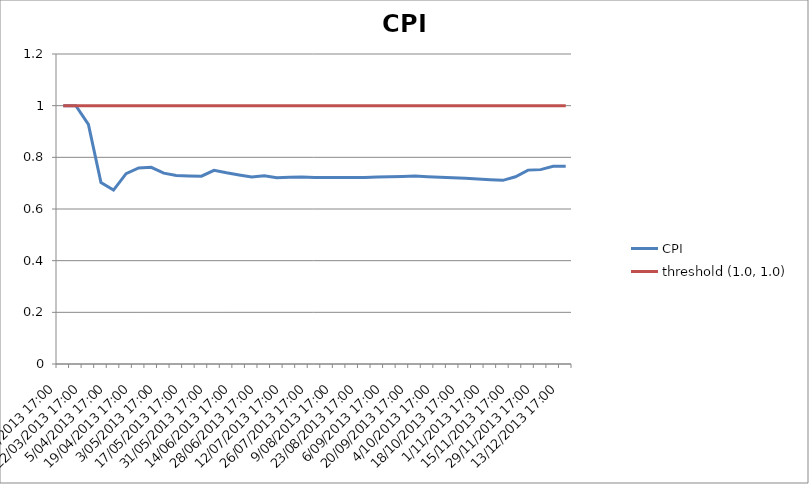
| Category | CPI | threshold (1.0, 1.0) |
|---|---|---|
| 8/03/2013 17:00 | 1 | 1 |
| 15/03/2013 17:00 | 1 | 1 |
| 22/03/2013 17:00 | 0.928 | 1 |
| 29/03/2013 17:00 | 0.702 | 1 |
| 5/04/2013 17:00 | 0.673 | 1 |
| 12/04/2013 17:00 | 0.737 | 1 |
| 19/04/2013 17:00 | 0.759 | 1 |
| 26/04/2013 17:00 | 0.761 | 1 |
| 3/05/2013 17:00 | 0.739 | 1 |
| 10/05/2013 17:00 | 0.73 | 1 |
| 17/05/2013 17:00 | 0.728 | 1 |
| 24/05/2013 17:00 | 0.727 | 1 |
| 31/05/2013 17:00 | 0.75 | 1 |
| 7/06/2013 17:00 | 0.74 | 1 |
| 14/06/2013 17:00 | 0.732 | 1 |
| 21/06/2013 17:00 | 0.724 | 1 |
| 28/06/2013 17:00 | 0.729 | 1 |
| 5/07/2013 17:00 | 0.721 | 1 |
| 12/07/2013 17:00 | 0.722 | 1 |
| 19/07/2013 17:00 | 0.724 | 1 |
| 26/07/2013 17:00 | 0.722 | 1 |
| 2/08/2013 17:00 | 0.722 | 1 |
| 9/08/2013 17:00 | 0.722 | 1 |
| 16/08/2013 17:00 | 0.722 | 1 |
| 23/08/2013 17:00 | 0.722 | 1 |
| 30/08/2013 17:00 | 0.723 | 1 |
| 6/09/2013 17:00 | 0.725 | 1 |
| 13/09/2013 17:00 | 0.726 | 1 |
| 20/09/2013 17:00 | 0.728 | 1 |
| 27/09/2013 17:00 | 0.725 | 1 |
| 4/10/2013 17:00 | 0.723 | 1 |
| 11/10/2013 17:00 | 0.721 | 1 |
| 18/10/2013 17:00 | 0.719 | 1 |
| 25/10/2013 17:00 | 0.716 | 1 |
| 1/11/2013 17:00 | 0.714 | 1 |
| 8/11/2013 17:00 | 0.711 | 1 |
| 15/11/2013 17:00 | 0.725 | 1 |
| 22/11/2013 17:00 | 0.75 | 1 |
| 29/11/2013 17:00 | 0.752 | 1 |
| 6/12/2013 17:00 | 0.765 | 1 |
| 13/12/2013 17:00 | 0.765 | 1 |